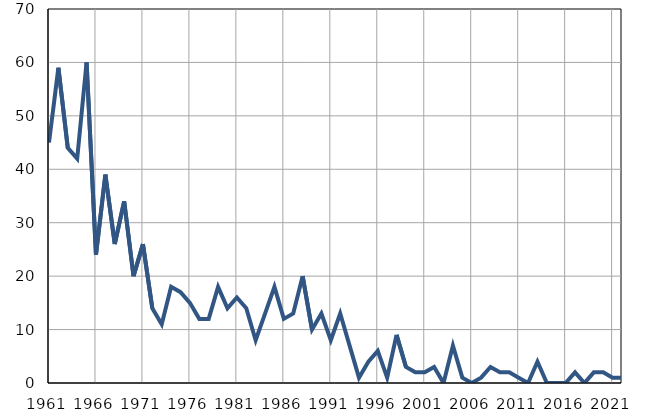
| Category | Умрла 
одојчад |
|---|---|
| 1961.0 | 45 |
| 1962.0 | 59 |
| 1963.0 | 44 |
| 1964.0 | 42 |
| 1965.0 | 60 |
| 1966.0 | 24 |
| 1967.0 | 39 |
| 1968.0 | 26 |
| 1969.0 | 34 |
| 1970.0 | 20 |
| 1971.0 | 26 |
| 1972.0 | 14 |
| 1973.0 | 11 |
| 1974.0 | 18 |
| 1975.0 | 17 |
| 1976.0 | 15 |
| 1977.0 | 12 |
| 1978.0 | 12 |
| 1979.0 | 18 |
| 1980.0 | 14 |
| 1981.0 | 16 |
| 1982.0 | 14 |
| 1983.0 | 8 |
| 1984.0 | 13 |
| 1985.0 | 18 |
| 1986.0 | 12 |
| 1987.0 | 13 |
| 1988.0 | 20 |
| 1989.0 | 10 |
| 1990.0 | 13 |
| 1991.0 | 8 |
| 1992.0 | 13 |
| 1993.0 | 7 |
| 1994.0 | 1 |
| 1995.0 | 4 |
| 1996.0 | 6 |
| 1997.0 | 1 |
| 1998.0 | 9 |
| 1999.0 | 3 |
| 2000.0 | 2 |
| 2001.0 | 2 |
| 2002.0 | 3 |
| 2003.0 | 0 |
| 2004.0 | 7 |
| 2005.0 | 1 |
| 2006.0 | 0 |
| 2007.0 | 1 |
| 2008.0 | 3 |
| 2009.0 | 2 |
| 2010.0 | 2 |
| 2011.0 | 1 |
| 2012.0 | 0 |
| 2013.0 | 4 |
| 2014.0 | 0 |
| 2015.0 | 0 |
| 2016.0 | 0 |
| 2017.0 | 2 |
| 2018.0 | 0 |
| 2019.0 | 2 |
| 2020.0 | 2 |
| 2021.0 | 1 |
| 2022.0 | 1 |